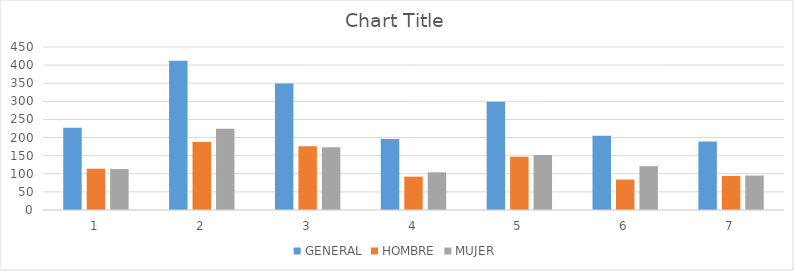
| Category | GENERAL | HOMBRE | MUJER |
|---|---|---|---|
| 0 | 227 | 114 | 113 |
| 1 | 412 | 188 | 224 |
| 2 | 349 | 176 | 173 |
| 3 | 196 | 92 | 104 |
| 4 | 299 | 147 | 152 |
| 5 | 205 | 84 | 121 |
| 6 | 189 | 94 | 95 |